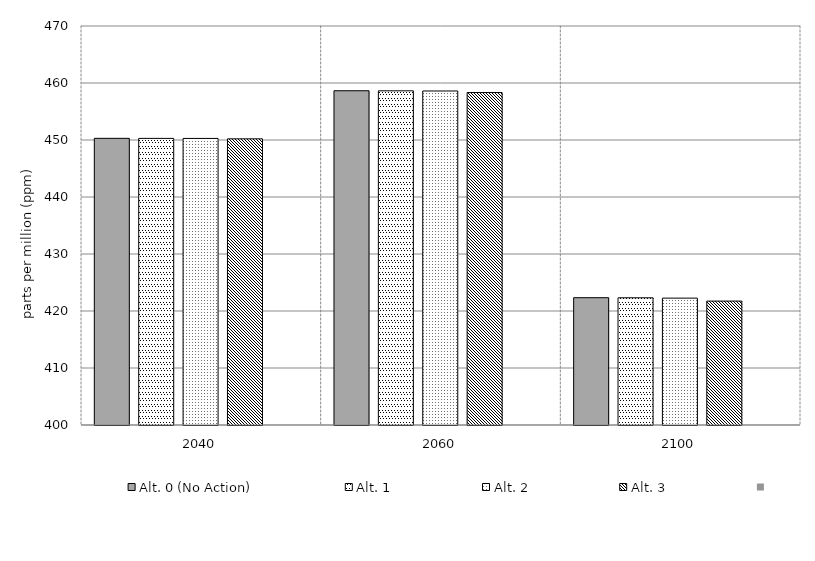
| Category | Alt. 0 (No Action) | Alt. 1 | Alt. 2 | Alt. 3 | Series 4 | Alt 5 | Alt 6 | Alt 7 | Alt 8 | Alt 10 |
|---|---|---|---|---|---|---|---|---|---|---|
| 2040.0 | 450.292 | 450.281 | 450.275 | 450.201 |  |  |  |  |  |  |
| 2060.0 | 458.643 | 458.627 | 458.597 | 458.323 |  |  |  |  |  |  |
| 2100.0 | 422.335 | 422.318 | 422.258 | 421.738 |  |  |  |  |  |  |